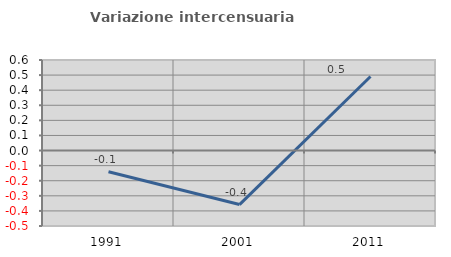
| Category | Variazione intercensuaria annua |
|---|---|
| 1991.0 | -0.14 |
| 2001.0 | -0.358 |
| 2011.0 | 0.491 |